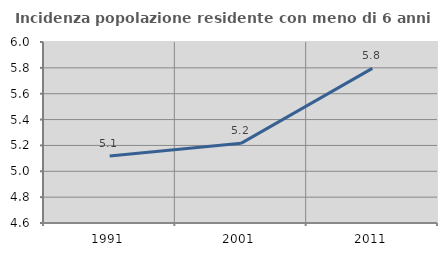
| Category | Incidenza popolazione residente con meno di 6 anni |
|---|---|
| 1991.0 | 5.118 |
| 2001.0 | 5.216 |
| 2011.0 | 5.796 |